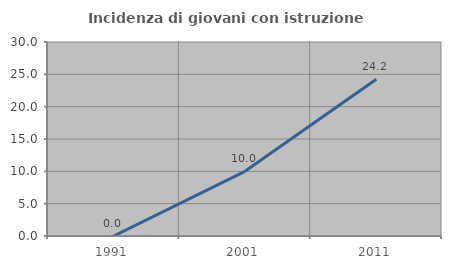
| Category | Incidenza di giovani con istruzione universitaria |
|---|---|
| 1991.0 | 0 |
| 2001.0 | 10 |
| 2011.0 | 24.242 |